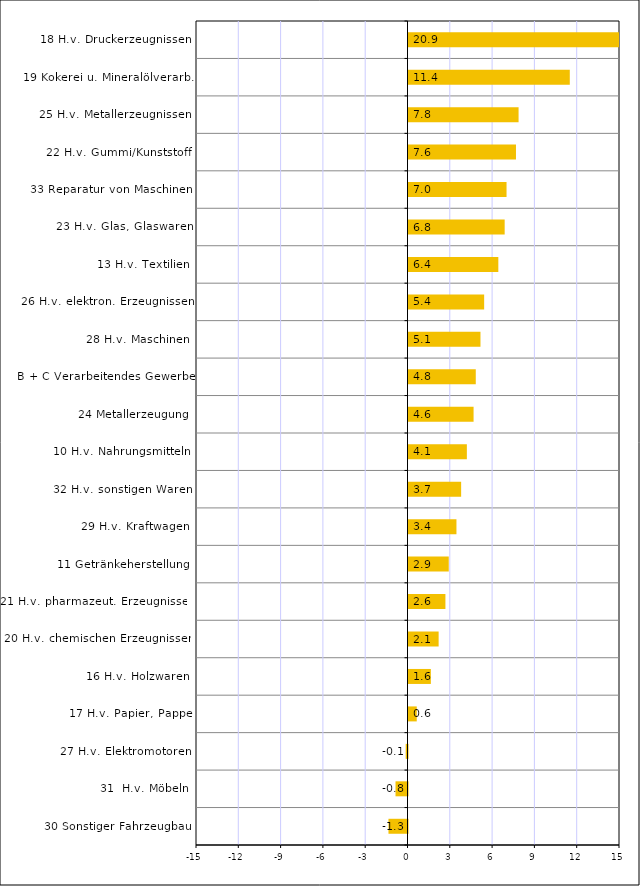
| Category | Series 0 |
|---|---|
| 30 Sonstiger Fahrzeugbau | -1.349 |
| 31  H.v. Möbeln | -0.85 |
| 27 H.v. Elektromotoren | -0.128 |
| 17 H.v. Papier, Pappe | 0.585 |
| 16 H.v. Holzwaren | 1.586 |
| 20 H.v. chemischen Erzeugnissen | 2.137 |
| 21 H.v. pharmazeut. Erzeugnissen | 2.618 |
| 11 Getränkeherstellung | 2.855 |
| 29 H.v. Kraftwagen | 3.4 |
| 32 H.v. sonstigen Waren | 3.734 |
| 10 H.v. Nahrungsmitteln | 4.139 |
| 24 Metallerzeugung | 4.615 |
| B + C Verarbeitendes Gewerbe | 4.771 |
| 28 H.v. Maschinen | 5.104 |
| 26 H.v. elektron. Erzeugnissen | 5.366 |
| 13 H.v. Textilien | 6.371 |
| 23 H.v. Glas, Glaswaren | 6.821 |
| 33 Reparatur von Maschinen | 6.953 |
| 22 H.v. Gummi/Kunststoff | 7.622 |
| 25 H.v. Metallerzeugnissen | 7.807 |
| 19 Kokerei u. Mineralölverarb. | 11.439 |
| 18 H.v. Druckerzeugnissen | 20.862 |